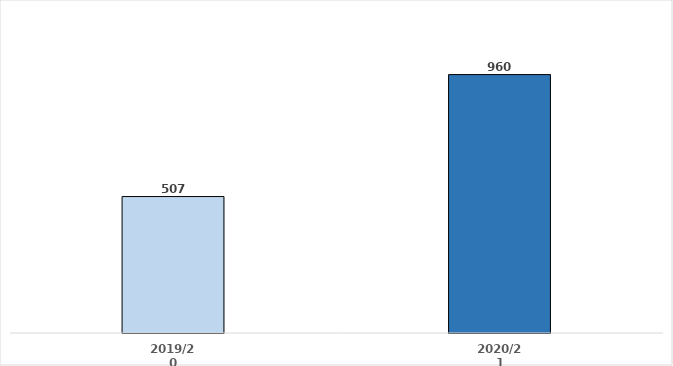
| Category | Series 0 |
|---|---|
| 2019/20 | 506.925 |
| 2020/21 | 960 |